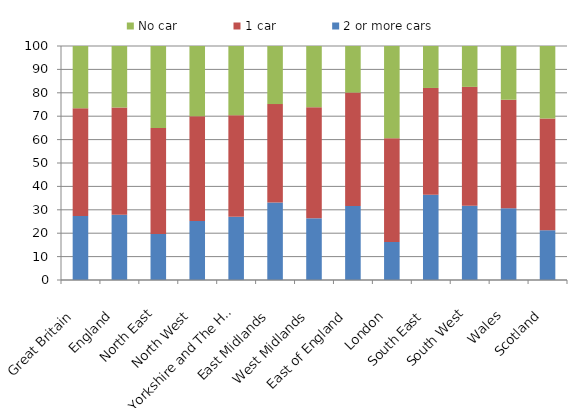
| Category | 2 or more cars | 1 car | No car |
|---|---|---|---|
| Great Britain | 27.387 | 46.029 | 26.584 |
| England | 27.849 | 45.82 | 26.331 |
| North East | 19.67 | 45.309 | 35.021 |
| North West | 25.244 | 44.779 | 29.977 |
| Yorkshire and The Humber | 26.994 | 43.423 | 29.583 |
| East Midlands | 33.087 | 42.103 | 24.81 |
| West Midlands | 26.366 | 47.47 | 26.164 |
| East of England | 31.66 | 48.433 | 19.907 |
| London | 16.248 | 44.28 | 39.472 |
| South East | 36.427 | 45.64 | 17.933 |
| South West | 31.771 | 50.771 | 17.458 |
| Wales | 30.697 | 46.36 | 22.943 |
| Scotland | 21.269 | 47.782 | 30.949 |